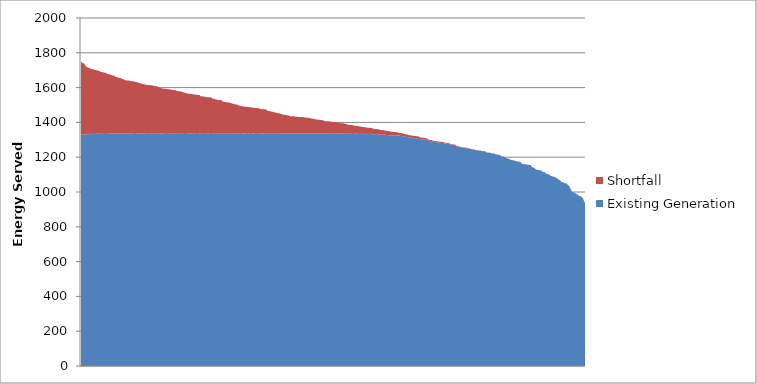
| Category | Existing Generation | Shortfall |
|---|---|---|
| 0 | 1328.846 | 418.492 |
| 1 | 1329.762 | 415.634 |
| 2 | 1330.356 | 409.509 |
| 3 | 1332.01 | 407.028 |
| 4 | 1329.888 | 400.896 |
| 5 | 1330.125 | 391.539 |
| 6 | 1331.479 | 386.005 |
| 7 | 1334.518 | 380.374 |
| 8 | 1333.595 | 380.368 |
| 9 | 1335.611 | 375.224 |
| 10 | 1329.842 | 376.845 |
| 11 | 1334.642 | 372.006 |
| 12 | 1331.797 | 372.03 |
| 13 | 1333.208 | 369.451 |
| 14 | 1332.557 | 369.435 |
| 15 | 1335.208 | 365.45 |
| 16 | 1334.303 | 364.178 |
| 17 | 1337.091 | 359.839 |
| 18 | 1333.247 | 363.177 |
| 19 | 1335.796 | 355.642 |
| 20 | 1331.26 | 358.891 |
| 21 | 1333.595 | 355.939 |
| 22 | 1335.267 | 352.553 |
| 23 | 1334.066 | 352.069 |
| 24 | 1333.511 | 352.446 |
| 25 | 1332.691 | 351.721 |
| 26 | 1336.452 | 342.358 |
| 27 | 1333.436 | 344.479 |
| 28 | 1333.383 | 343.435 |
| 29 | 1336.548 | 338 |
| 30 | 1334.108 | 339.81 |
| 31 | 1338.015 | 332.067 |
| 32 | 1336.679 | 333.201 |
| 33 | 1336.46 | 332.503 |
| 34 | 1335.832 | 326.687 |
| 35 | 1336.457 | 325.107 |
| 36 | 1335.587 | 323.464 |
| 37 | 1336.881 | 321.34 |
| 38 | 1335.499 | 320.5 |
| 39 | 1336.478 | 318.671 |
| 40 | 1335.669 | 317.665 |
| 41 | 1337.944 | 311.785 |
| 42 | 1334.767 | 314.871 |
| 43 | 1337.71 | 307.309 |
| 44 | 1337.289 | 304.932 |
| 45 | 1335.851 | 305.75 |
| 46 | 1336.34 | 304.744 |
| 47 | 1337.811 | 302.651 |
| 48 | 1337.503 | 302.314 |
| 49 | 1336.084 | 302.341 |
| 50 | 1334.978 | 302.531 |
| 51 | 1335.705 | 300.899 |
| 52 | 1337.464 | 299.037 |
| 53 | 1338.76 | 296.506 |
| 54 | 1339.743 | 293.665 |
| 55 | 1337.037 | 295.331 |
| 56 | 1338.433 | 290.84 |
| 57 | 1338.075 | 290.421 |
| 58 | 1336.774 | 290.585 |
| 59 | 1335.814 | 289.148 |
| 60 | 1337.288 | 285.77 |
| 61 | 1335.896 | 284.196 |
| 62 | 1337.532 | 282.507 |
| 63 | 1337.947 | 281.132 |
| 64 | 1336.076 | 281.46 |
| 65 | 1338.192 | 277.948 |
| 66 | 1338.22 | 277.125 |
| 67 | 1339.312 | 275.923 |
| 68 | 1337.281 | 277.474 |
| 69 | 1335.729 | 278.056 |
| 70 | 1338.317 | 275.114 |
| 71 | 1337.944 | 274.285 |
| 72 | 1338.137 | 273.744 |
| 73 | 1338.487 | 271.381 |
| 74 | 1335.442 | 272.992 |
| 75 | 1337.46 | 270.189 |
| 76 | 1336.227 | 270.688 |
| 77 | 1339.71 | 263.269 |
| 78 | 1337.742 | 262.269 |
| 79 | 1336.026 | 262.571 |
| 80 | 1337.136 | 259.866 |
| 81 | 1338.318 | 257.729 |
| 82 | 1336.217 | 257.86 |
| 83 | 1339.479 | 254.142 |
| 84 | 1337.446 | 256.1 |
| 85 | 1337.322 | 255.611 |
| 86 | 1340.187 | 251.726 |
| 87 | 1338.184 | 253.225 |
| 88 | 1336.755 | 253.735 |
| 89 | 1338.624 | 250.345 |
| 90 | 1339.35 | 249.558 |
| 91 | 1337.247 | 249.454 |
| 92 | 1335.791 | 249.906 |
| 93 | 1337.445 | 247.575 |
| 94 | 1338.389 | 246.597 |
| 95 | 1336.102 | 245.454 |
| 96 | 1338.56 | 242.642 |
| 97 | 1338.15 | 241.197 |
| 98 | 1337.073 | 241.932 |
| 99 | 1339.911 | 237.488 |
| 100 | 1336.618 | 240.406 |
| 101 | 1337.804 | 236.985 |
| 102 | 1339.004 | 234.624 |
| 103 | 1338.812 | 231.879 |
| 104 | 1338.521 | 231.591 |
| 105 | 1338.95 | 229.237 |
| 106 | 1337.638 | 227.484 |
| 107 | 1338.325 | 226.091 |
| 108 | 1337.612 | 226.621 |
| 109 | 1337.075 | 226.995 |
| 110 | 1338.183 | 225.171 |
| 111 | 1338.347 | 224.774 |
| 112 | 1337.503 | 223.608 |
| 113 | 1337.94 | 222.505 |
| 114 | 1337.369 | 222.211 |
| 115 | 1339.346 | 219.964 |
| 116 | 1339.345 | 218.851 |
| 117 | 1338.054 | 219.57 |
| 118 | 1337.934 | 218.725 |
| 119 | 1338.158 | 212.689 |
| 120 | 1337.615 | 212.574 |
| 121 | 1339.513 | 210.23 |
| 122 | 1337.636 | 210.769 |
| 123 | 1339.079 | 209.03 |
| 124 | 1338.238 | 208.17 |
| 125 | 1338.336 | 207.146 |
| 126 | 1337.402 | 207.652 |
| 127 | 1338.298 | 206.362 |
| 128 | 1337.966 | 206.337 |
| 129 | 1338.757 | 204.876 |
| 130 | 1339.328 | 203.197 |
| 131 | 1337.565 | 199.107 |
| 132 | 1337.91 | 197.708 |
| 133 | 1337.846 | 197.417 |
| 134 | 1337.525 | 194.873 |
| 135 | 1336.528 | 194.153 |
| 136 | 1338.335 | 191.579 |
| 137 | 1337.48 | 191.594 |
| 138 | 1338.158 | 190.502 |
| 139 | 1338.116 | 189.851 |
| 140 | 1338.621 | 189.18 |
| 141 | 1336.631 | 183.972 |
| 142 | 1337.842 | 180.187 |
| 143 | 1337.697 | 180.028 |
| 144 | 1338.002 | 178.582 |
| 145 | 1337.351 | 178.88 |
| 146 | 1338.675 | 176.253 |
| 147 | 1336.725 | 177.596 |
| 148 | 1338.011 | 175.448 |
| 149 | 1338.205 | 173.509 |
| 150 | 1337.894 | 171.864 |
| 151 | 1336.981 | 170.852 |
| 152 | 1335.792 | 171.268 |
| 153 | 1338.897 | 165.409 |
| 154 | 1338.074 | 165.49 |
| 155 | 1337.269 | 165.135 |
| 156 | 1337.395 | 163.826 |
| 157 | 1336.864 | 160.294 |
| 158 | 1338.116 | 158.656 |
| 159 | 1338.599 | 156.566 |
| 160 | 1336.994 | 157.286 |
| 161 | 1336.504 | 156.054 |
| 162 | 1337.843 | 153.068 |
| 163 | 1335.183 | 155.354 |
| 164 | 1337.741 | 152.693 |
| 165 | 1338.371 | 151.853 |
| 166 | 1338.371 | 150.246 |
| 167 | 1336.285 | 151.973 |
| 168 | 1339.403 | 148.128 |
| 169 | 1337.61 | 149.225 |
| 170 | 1338.973 | 146.779 |
| 171 | 1336.513 | 148.752 |
| 172 | 1336.519 | 147.787 |
| 173 | 1336.908 | 146.375 |
| 174 | 1339.325 | 143.74 |
| 175 | 1338.671 | 144.185 |
| 176 | 1337.403 | 144.601 |
| 177 | 1338.775 | 142.77 |
| 178 | 1337.389 | 141.734 |
| 179 | 1336.449 | 140.85 |
| 180 | 1335.801 | 139.633 |
| 181 | 1336.682 | 138.672 |
| 182 | 1336.061 | 139.267 |
| 183 | 1339.44 | 135.706 |
| 184 | 1336.268 | 138.164 |
| 185 | 1338.524 | 134.025 |
| 186 | 1337.408 | 128.907 |
| 187 | 1338.996 | 126.708 |
| 188 | 1337.853 | 125.955 |
| 189 | 1335.417 | 128.008 |
| 190 | 1338.162 | 124.657 |
| 191 | 1336.609 | 123.901 |
| 192 | 1338.104 | 121.04 |
| 193 | 1338.631 | 118.812 |
| 194 | 1338.069 | 117.815 |
| 195 | 1337.233 | 117.041 |
| 196 | 1336.428 | 117.123 |
| 197 | 1337.353 | 114.769 |
| 198 | 1338.365 | 112.378 |
| 199 | 1335.635 | 113.607 |
| 200 | 1337.738 | 110.864 |
| 201 | 1338.809 | 104.798 |
| 202 | 1335.256 | 108.279 |
| 203 | 1334.029 | 109.461 |
| 204 | 1338.421 | 104.41 |
| 205 | 1335.81 | 105.631 |
| 206 | 1335.386 | 104.681 |
| 207 | 1338.308 | 101.588 |
| 208 | 1335.084 | 101.113 |
| 209 | 1335.33 | 100.354 |
| 210 | 1338.435 | 97.087 |
| 211 | 1335.817 | 99.581 |
| 212 | 1337.685 | 97.465 |
| 213 | 1334.209 | 99.745 |
| 214 | 1337.28 | 95.146 |
| 215 | 1335.255 | 96.772 |
| 216 | 1336.474 | 95.262 |
| 217 | 1337.343 | 94.159 |
| 218 | 1336.149 | 95.175 |
| 219 | 1337.464 | 93.757 |
| 220 | 1338.037 | 92.69 |
| 221 | 1334.187 | 96.258 |
| 222 | 1338.382 | 91.671 |
| 223 | 1335.083 | 92.901 |
| 224 | 1335.597 | 92.062 |
| 225 | 1337.557 | 89.476 |
| 226 | 1334.717 | 91.619 |
| 227 | 1335.21 | 90.462 |
| 228 | 1335.82 | 88.613 |
| 229 | 1335.839 | 88.177 |
| 230 | 1337.594 | 84.369 |
| 231 | 1338.718 | 82.14 |
| 232 | 1335.824 | 84.445 |
| 233 | 1336.081 | 84.035 |
| 234 | 1335.676 | 81.409 |
| 235 | 1337.517 | 79.408 |
| 236 | 1335.829 | 79.911 |
| 237 | 1337.126 | 77.532 |
| 238 | 1336.526 | 77.898 |
| 239 | 1335.209 | 78.858 |
| 240 | 1333.804 | 79.37 |
| 241 | 1338.337 | 73.491 |
| 242 | 1336.849 | 73.694 |
| 243 | 1335.962 | 71.311 |
| 244 | 1336.957 | 70.266 |
| 245 | 1336.082 | 71.047 |
| 246 | 1335.478 | 70.93 |
| 247 | 1334.17 | 71.869 |
| 248 | 1337.569 | 67.572 |
| 249 | 1337.246 | 67.674 |
| 250 | 1334.54 | 68.415 |
| 251 | 1334.403 | 68.262 |
| 252 | 1335.906 | 65.984 |
| 253 | 1333.586 | 67.07 |
| 254 | 1337.445 | 62.911 |
| 255 | 1333.901 | 65.596 |
| 256 | 1337.584 | 60.711 |
| 257 | 1337.92 | 58.521 |
| 258 | 1332.894 | 63.377 |
| 259 | 1337.681 | 57.959 |
| 260 | 1337.407 | 57.906 |
| 261 | 1334.888 | 60.056 |
| 262 | 1338.842 | 55.243 |
| 263 | 1336.145 | 56.557 |
| 264 | 1336.558 | 55.05 |
| 265 | 1334.886 | 52.701 |
| 266 | 1333.827 | 53.258 |
| 267 | 1336.13 | 49.654 |
| 268 | 1337.199 | 48.425 |
| 269 | 1334.32 | 51.094 |
| 270 | 1332.8 | 51.624 |
| 271 | 1333.288 | 49.924 |
| 272 | 1334.884 | 47.541 |
| 273 | 1335.821 | 43.935 |
| 274 | 1335.131 | 44.548 |
| 275 | 1332.091 | 46.878 |
| 276 | 1336.078 | 42.255 |
| 277 | 1333.599 | 44.199 |
| 278 | 1333.865 | 42.661 |
| 279 | 1335.511 | 40.133 |
| 280 | 1332.743 | 40.885 |
| 281 | 1332.838 | 40.398 |
| 282 | 1332.23 | 40.678 |
| 283 | 1335.173 | 37.437 |
| 284 | 1331.683 | 39.125 |
| 285 | 1331.87 | 38.822 |
| 286 | 1334.414 | 34.498 |
| 287 | 1333.49 | 35.368 |
| 288 | 1331.383 | 36.562 |
| 289 | 1335.322 | 32.351 |
| 290 | 1332.065 | 34.935 |
| 291 | 1327.892 | 35.635 |
| 292 | 1332.295 | 30.486 |
| 293 | 1331.865 | 30.657 |
| 294 | 1334.691 | 27.136 |
| 295 | 1332.345 | 28.689 |
| 296 | 1330.771 | 29.869 |
| 297 | 1329.782 | 30.333 |
| 298 | 1328.649 | 27.656 |
| 299 | 1330.907 | 25.307 |
| 300 | 1330.694 | 25.447 |
| 301 | 1328.69 | 27.078 |
| 302 | 1331.191 | 23.066 |
| 303 | 1329.546 | 23.002 |
| 304 | 1326.71 | 25.039 |
| 305 | 1328.363 | 22.07 |
| 306 | 1326.939 | 23.144 |
| 307 | 1326.342 | 22.364 |
| 308 | 1326.677 | 20.8 |
| 309 | 1325.165 | 22.077 |
| 310 | 1324.887 | 21.506 |
| 311 | 1325.601 | 19.813 |
| 312 | 1325.484 | 19.162 |
| 313 | 1325.273 | 19.236 |
| 314 | 1325.101 | 19.303 |
| 315 | 1324.395 | 18.074 |
| 316 | 1324.486 | 17.222 |
| 317 | 1324.391 | 15.974 |
| 318 | 1322.659 | 16.738 |
| 319 | 1321.865 | 16.653 |
| 320 | 1320.755 | 14.898 |
| 321 | 1320.671 | 14.957 |
| 322 | 1320.44 | 14.3 |
| 323 | 1317.235 | 15.407 |
| 324 | 1316.453 | 14.595 |
| 325 | 1315.895 | 14.166 |
| 326 | 1314.11 | 13.118 |
| 327 | 1314.041 | 12.518 |
| 328 | 1313.336 | 12.578 |
| 329 | 1311.55 | 13.339 |
| 330 | 1313.044 | 11.529 |
| 331 | 1310.632 | 12.291 |
| 332 | 1309.348 | 12.958 |
| 333 | 1309.919 | 12.23 |
| 334 | 1308.548 | 11.82 |
| 335 | 1310.598 | 9.594 |
| 336 | 1308.217 | 11.546 |
| 337 | 1304.523 | 10.775 |
| 338 | 1303.66 | 9.749 |
| 339 | 1302.378 | 10.202 |
| 340 | 1303.401 | 8.822 |
| 341 | 1303.489 | 8.009 |
| 342 | 1302.135 | 9.019 |
| 343 | 1300.49 | 9.45 |
| 344 | 1300.253 | 8.568 |
| 345 | 1297.328 | 8.705 |
| 346 | 1296.216 | 7.185 |
| 347 | 1292.881 | 6.585 |
| 348 | 1292.69 | 6.668 |
| 349 | 1292.1 | 7.208 |
| 350 | 1289.432 | 6.816 |
| 351 | 1288.748 | 6.297 |
| 352 | 1288.939 | 6.003 |
| 353 | 1286.871 | 5.759 |
| 354 | 1285.764 | 6.128 |
| 355 | 1284.671 | 5.88 |
| 356 | 1284.452 | 5.618 |
| 357 | 1284.494 | 5.299 |
| 358 | 1283.028 | 5.232 |
| 359 | 1282.176 | 5.71 |
| 360 | 1282.285 | 5.15 |
| 361 | 1281.392 | 4.884 |
| 362 | 1279.295 | 5.172 |
| 363 | 1278.507 | 5.279 |
| 364 | 1278.28 | 4.729 |
| 365 | 1276.602 | 4.581 |
| 366 | 1276.245 | 4.523 |
| 367 | 1276.245 | 3.966 |
| 368 | 1272.321 | 3.897 |
| 369 | 1271.765 | 3.318 |
| 370 | 1271.188 | 3.887 |
| 371 | 1269.463 | 4.058 |
| 372 | 1269.856 | 3.519 |
| 373 | 1268.364 | 3.691 |
| 374 | 1262.289 | 2.926 |
| 375 | 1261.965 | 3.232 |
| 376 | 1262.075 | 2.759 |
| 377 | 1257.944 | 2.651 |
| 378 | 1257.022 | 2.829 |
| 379 | 1256.614 | 2.403 |
| 380 | 1255.903 | 2.494 |
| 381 | 1254.572 | 2.291 |
| 382 | 1253.271 | 2.451 |
| 383 | 1252.523 | 2.262 |
| 384 | 1251.876 | 2.298 |
| 385 | 1251.314 | 2.508 |
| 386 | 1249.516 | 2.258 |
| 387 | 1249.27 | 1.869 |
| 388 | 1247.208 | 2.019 |
| 389 | 1245.316 | 2.05 |
| 390 | 1244.893 | 1.85 |
| 391 | 1243.586 | 1.916 |
| 392 | 1241.027 | 1.682 |
| 393 | 1241.018 | 1.366 |
| 394 | 1239.991 | 1.509 |
| 395 | 1239.71 | 1.73 |
| 396 | 1237.61 | 1.538 |
| 397 | 1237.313 | 1.468 |
| 398 | 1236.477 | 1.439 |
| 399 | 1235.129 | 1.068 |
| 400 | 1234.73 | 1.414 |
| 401 | 1234.814 | 1.274 |
| 402 | 1234.652 | 1.178 |
| 403 | 1230.445 | 1.383 |
| 404 | 1226.554 | 1.193 |
| 405 | 1226.356 | 1.016 |
| 406 | 1225.119 | 1.218 |
| 407 | 1225.095 | 0.963 |
| 408 | 1224.738 | 0.966 |
| 409 | 1221.933 | 0.963 |
| 410 | 1221.645 | 0.931 |
| 411 | 1220.936 | 1.012 |
| 412 | 1219.217 | 0.746 |
| 413 | 1217.471 | 0.825 |
| 414 | 1215.141 | 0.753 |
| 415 | 1214.786 | 0.685 |
| 416 | 1212.774 | 0.744 |
| 417 | 1212.316 | 0.746 |
| 418 | 1208.994 | 0.508 |
| 419 | 1203.796 | 0.369 |
| 420 | 1203.503 | 0.343 |
| 421 | 1203.142 | 0.368 |
| 422 | 1199.968 | 0.405 |
| 423 | 1198.194 | 0.352 |
| 424 | 1193.445 | 0.449 |
| 425 | 1192.322 | 0.424 |
| 426 | 1190.486 | 0.35 |
| 427 | 1188.248 | 0.235 |
| 428 | 1185.405 | 0.365 |
| 429 | 1183.423 | 0.206 |
| 430 | 1182.969 | 0.273 |
| 431 | 1182.129 | 0.377 |
| 432 | 1179.395 | 0.319 |
| 433 | 1177.134 | 0.196 |
| 434 | 1176.15 | 0.153 |
| 435 | 1175.518 | 0.259 |
| 436 | 1175.231 | 0.294 |
| 437 | 1174.155 | 0.231 |
| 438 | 1171.872 | 0.214 |
| 439 | 1162.496 | 0.114 |
| 440 | 1162.336 | 0.174 |
| 441 | 1160.201 | 0.156 |
| 442 | 1159.777 | 0.234 |
| 443 | 1158.924 | 0.105 |
| 444 | 1157.397 | 0.118 |
| 445 | 1157.026 | 0.147 |
| 446 | 1156.969 | 0.069 |
| 447 | 1154.669 | 0.14 |
| 448 | 1154.711 | 0.095 |
| 449 | 1143.928 | 0.13 |
| 450 | 1141.411 | 0.143 |
| 451 | 1140.199 | 0.12 |
| 452 | 1135.966 | 0.061 |
| 453 | 1129.191 | 0.053 |
| 454 | 1128.545 | 0.046 |
| 455 | 1126.189 | 0.063 |
| 456 | 1125.798 | 0.037 |
| 457 | 1125.217 | 0.026 |
| 458 | 1125.116 | 0.059 |
| 459 | 1120.711 | 0.034 |
| 460 | 1115.06 | 0.046 |
| 461 | 1114.901 | 0.031 |
| 462 | 1114.038 | 0.027 |
| 463 | 1106.286 | 0.004 |
| 464 | 1104.092 | 0.017 |
| 465 | 1103.736 | 0.04 |
| 466 | 1101.667 | 0.01 |
| 467 | 1096.106 | 0.043 |
| 468 | 1092.439 | 0.017 |
| 469 | 1091.784 | 0.007 |
| 470 | 1088.359 | 0.019 |
| 471 | 1087.27 | 0.009 |
| 472 | 1085.971 | 0.006 |
| 473 | 1082.526 | 0.005 |
| 474 | 1080.111 | 0 |
| 475 | 1073.756 | 0.017 |
| 476 | 1071.611 | 0.027 |
| 477 | 1067.991 | 0.004 |
| 478 | 1061.455 | 0.011 |
| 479 | 1056.126 | 0.001 |
| 480 | 1055.792 | 0 |
| 481 | 1054.608 | 0 |
| 482 | 1050.172 | 0.008 |
| 483 | 1049.986 | 0.015 |
| 484 | 1047.866 | 0 |
| 485 | 1039.802 | 0 |
| 486 | 1036.473 | 0 |
| 487 | 1023.349 | 0.012 |
| 488 | 1015.421 | 0 |
| 489 | 1000.686 | 0 |
| 490 | 999.736 | 0 |
| 491 | 996.318 | 0 |
| 492 | 995.148 | 0 |
| 493 | 989.625 | 0 |
| 494 | 987.259 | 0 |
| 495 | 981.815 | 0 |
| 496 | 979.593 | 0 |
| 497 | 976.274 | 0 |
| 498 | 976.239 | 0 |
| 499 | 968.455 | 0 |
| 500 | 965.991 | 0 |
| 501 | 947.147 | 0 |
| 502 | 938.325 | 0 |
| 503 | 937.11 | 0 |